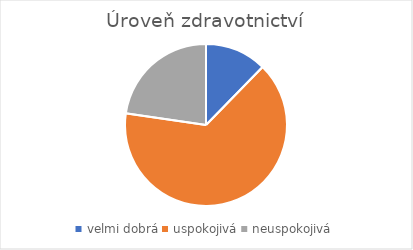
| Category | Úroveň zdravotnictví |
|---|---|
| velmi dobrá | 32 |
| uspokojivá | 169 |
| neuspokojivá | 59 |